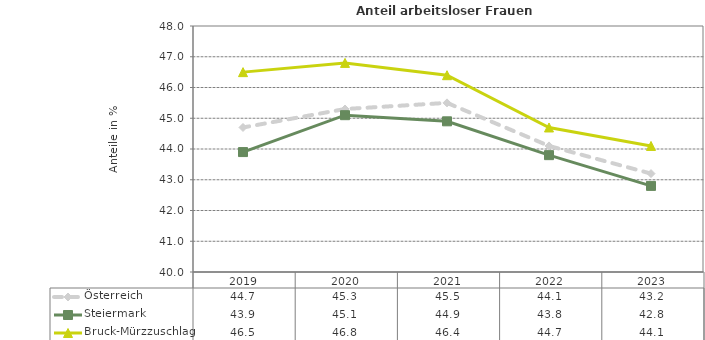
| Category | Österreich | Steiermark | Bruck-Mürzzuschlag |
|---|---|---|---|
| 2023.0 | 43.2 | 42.8 | 44.1 |
| 2022.0 | 44.1 | 43.8 | 44.7 |
| 2021.0 | 45.5 | 44.9 | 46.4 |
| 2020.0 | 45.3 | 45.1 | 46.8 |
| 2019.0 | 44.7 | 43.9 | 46.5 |